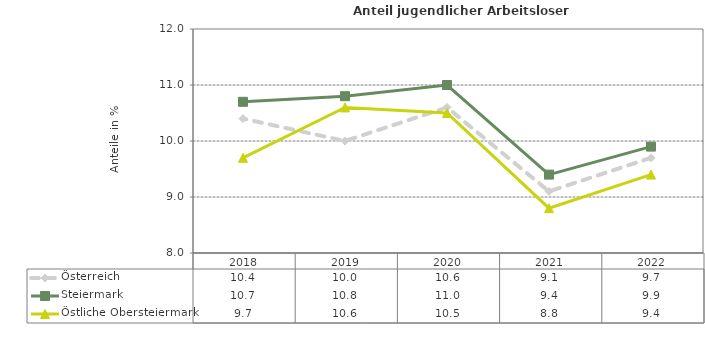
| Category | Österreich | Steiermark | Östliche Obersteiermark |
|---|---|---|---|
| 2022.0 | 9.7 | 9.9 | 9.4 |
| 2021.0 | 9.1 | 9.4 | 8.8 |
| 2020.0 | 10.6 | 11 | 10.5 |
| 2019.0 | 10 | 10.8 | 10.6 |
| 2018.0 | 10.4 | 10.7 | 9.7 |